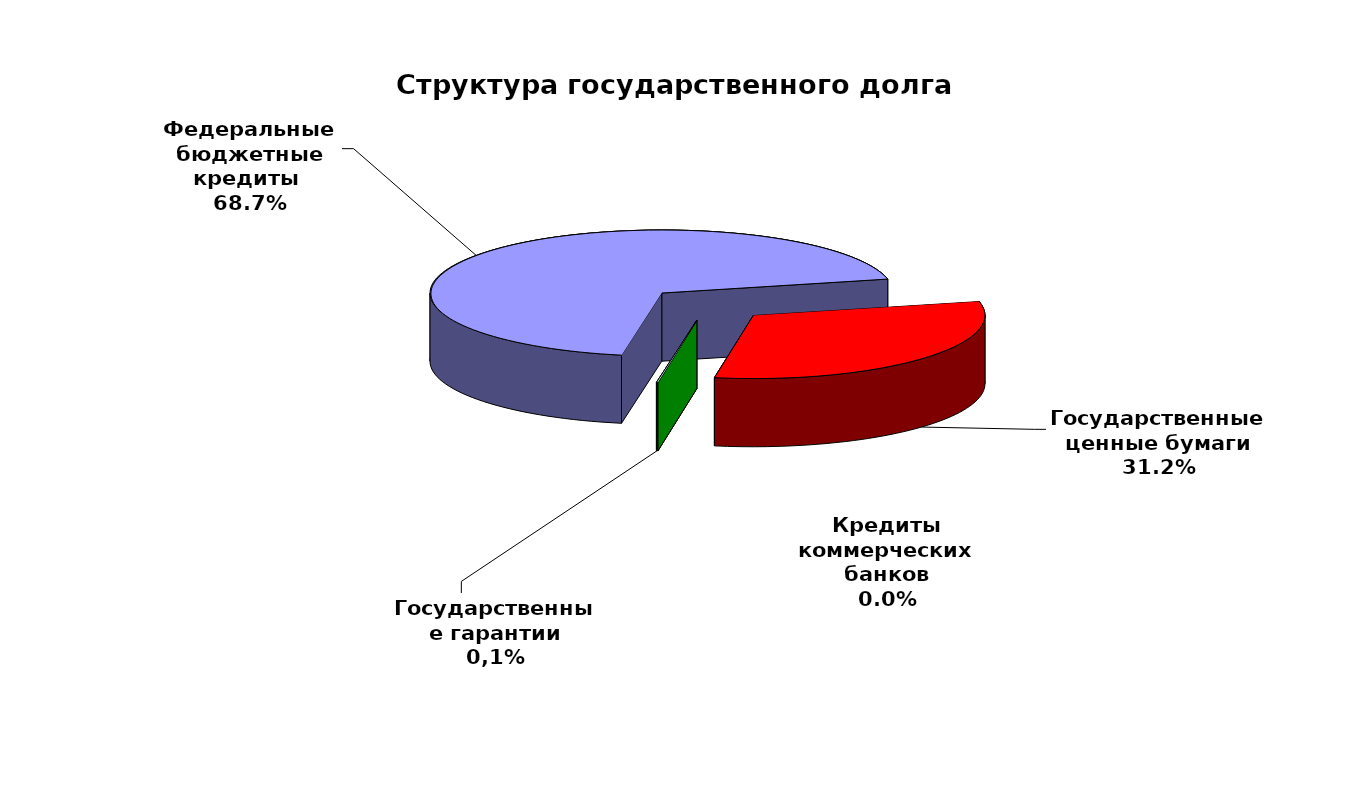
| Category | Series 0 |
|---|---|
| Федеральные бюджетные кредиты  | 91228290.06 |
| Государственные ценные бумаги | 41500000 |
| Кредиты коммерческих банков | 0 |
| Государственные гарантии | 129957.743 |